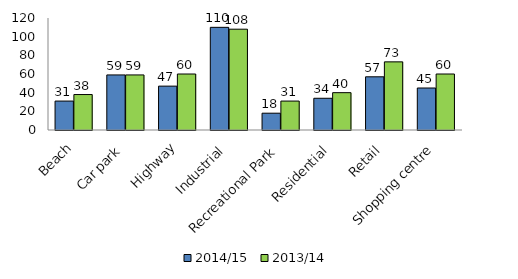
| Category | 2014/15 | 2013/14 |
|---|---|---|
| Beach | 31 | 38 |
| Car park | 59 | 59 |
| Highway | 47 | 60 |
| Industrial | 110 | 108 |
| Recreational Park | 18 | 31 |
| Residential | 34 | 40 |
| Retail | 57 | 73 |
| Shopping centre | 45 | 60 |